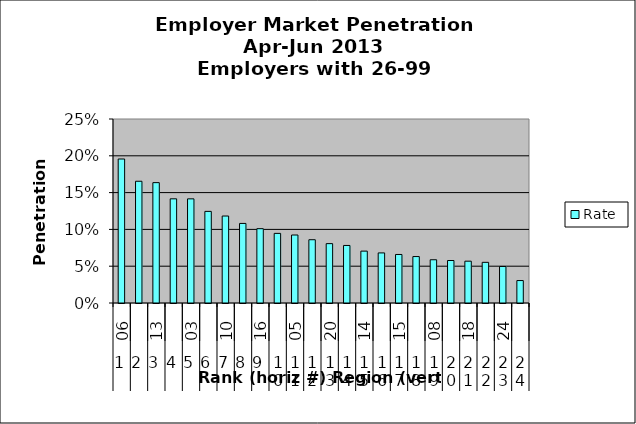
| Category | Rate |
|---|---|
| 0 | 0.196 |
| 1 | 0.165 |
| 2 | 0.164 |
| 3 | 0.142 |
| 4 | 0.142 |
| 5 | 0.124 |
| 6 | 0.118 |
| 7 | 0.108 |
| 8 | 0.101 |
| 9 | 0.095 |
| 10 | 0.092 |
| 11 | 0.086 |
| 12 | 0.081 |
| 13 | 0.078 |
| 14 | 0.07 |
| 15 | 0.068 |
| 16 | 0.066 |
| 17 | 0.063 |
| 18 | 0.059 |
| 19 | 0.058 |
| 20 | 0.057 |
| 21 | 0.055 |
| 22 | 0.05 |
| 23 | 0.031 |